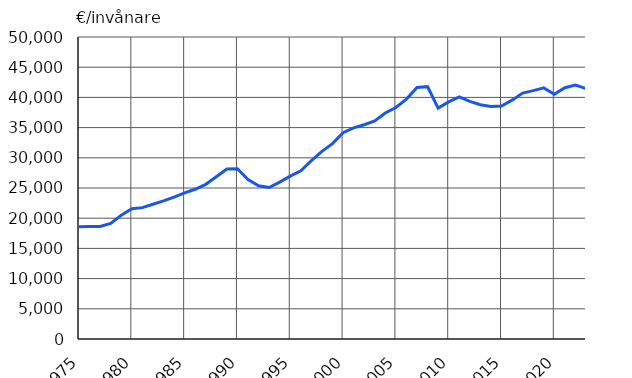
| Category | €/invånare |
|---|---|
| 1975 | 18576 |
| 1976 | 18613 |
| 1977 | 18621 |
| 1978 | 19152 |
| 1979 | 20475 |
| 1980 | 21561 |
| 1981 | 21751 |
| 1982 | 22302 |
| 1983 | 22860 |
| 1984 | 23475 |
| 1985 | 24207 |
| 1986 | 24793 |
| 1987 | 25607 |
| 1988 | 26864 |
| 1989 | 28129 |
| 1990 | 28193 |
| 1991 | 26389 |
| 1992 | 25376 |
| 1993 | 25087 |
| 1994 | 25969 |
| 1995 | 26961 |
| 1996 | 27858 |
| 1997 | 29535 |
| 1998 | 31064 |
| 1999 | 32349 |
| 2000 | 34145 |
| 2001 | 34957 |
| 2002 | 35468 |
| 2003 | 36092 |
| 2004 | 37424 |
| 2005 | 38333 |
| 2006 | 39724 |
| 2007 | 41652 |
| 2008 | 41783 |
| 2009 | 38226 |
| 2010 | 39263 |
| 2011 | 40078 |
| 2012 | 39330 |
| 2013 | 38796 |
| 2014 | 38488 |
| 2015 | 38570 |
| 2016 | 39548 |
| 2017 | 40715 |
| 2018 | 41119 |
| 2019 | 41582 |
| 2020 | 40536 |
| 2021 | 41605 |
| 2022* | 42044 |
| 2023* | 41456 |